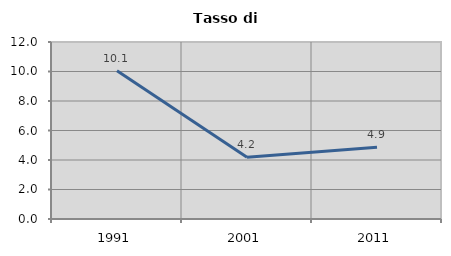
| Category | Tasso di disoccupazione   |
|---|---|
| 1991.0 | 10.051 |
| 2001.0 | 4.179 |
| 2011.0 | 4.859 |